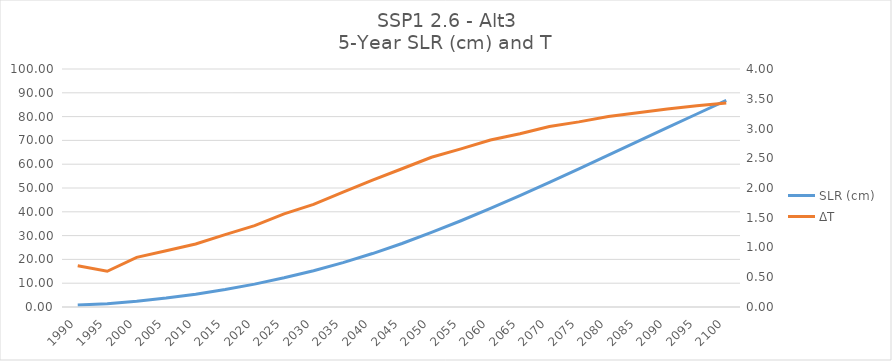
| Category | SLR (cm) |
|---|---|
| 1990.0 | 0.87 |
| 1995.0 | 1.399 |
| 2000.0 | 2.407 |
| 2005.0 | 3.755 |
| 2010.0 | 5.386 |
| 2015.0 | 7.344 |
| 2020.0 | 9.606 |
| 2025.0 | 12.264 |
| 2030.0 | 15.242 |
| 2035.0 | 18.639 |
| 2040.0 | 22.46 |
| 2045.0 | 26.684 |
| 2050.0 | 31.321 |
| 2055.0 | 36.234 |
| 2060.0 | 41.442 |
| 2065.0 | 46.814 |
| 2070.0 | 52.389 |
| 2075.0 | 58.039 |
| 2080.0 | 63.789 |
| 2085.0 | 69.559 |
| 2090.0 | 75.331 |
| 2095.0 | 81.094 |
| 2100.0 | 86.804 |